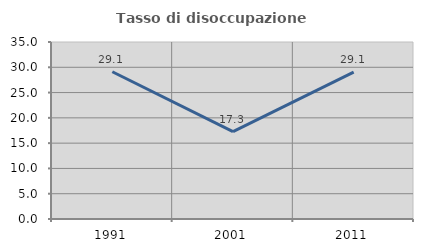
| Category | Tasso di disoccupazione giovanile  |
|---|---|
| 1991.0 | 29.112 |
| 2001.0 | 17.27 |
| 2011.0 | 29.054 |